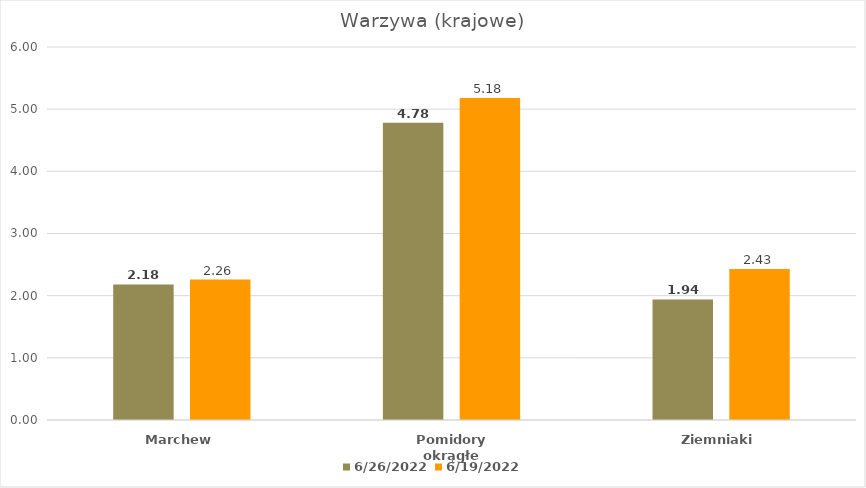
| Category | 26.06.2022 | 19.06.2022 |
|---|---|---|
| Marchew | 2.18 | 2.26 |
| Pomidory okrągłe | 4.78 | 5.18 |
| Ziemniaki | 1.94 | 2.43 |